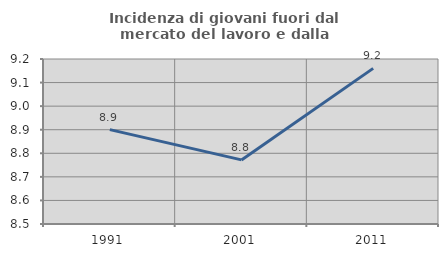
| Category | Incidenza di giovani fuori dal mercato del lavoro e dalla formazione  |
|---|---|
| 1991.0 | 8.901 |
| 2001.0 | 8.772 |
| 2011.0 | 9.16 |